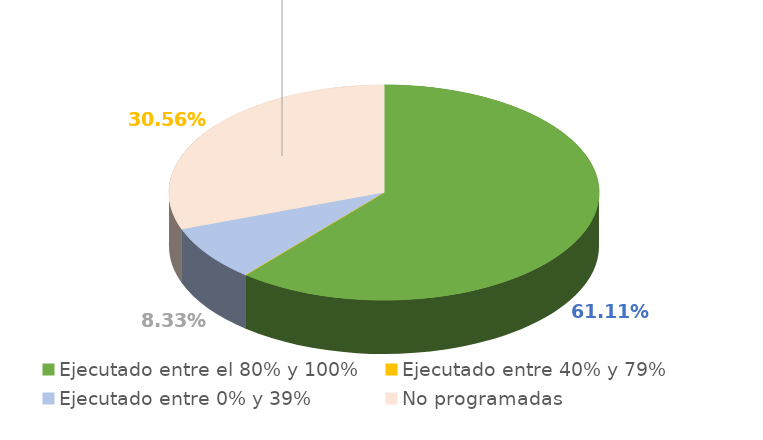
| Category | Series 0 |
|---|---|
| Ejecutado entre el 80% y 100% | 0.611 |
| Ejecutado entre 40% y 79% | 0 |
| Ejecutado entre 0% y 39% | 0.083 |
| No programadas | 0.306 |